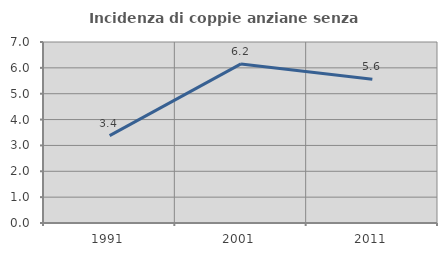
| Category | Incidenza di coppie anziane senza figli  |
|---|---|
| 1991.0 | 3.381 |
| 2001.0 | 6.152 |
| 2011.0 | 5.561 |